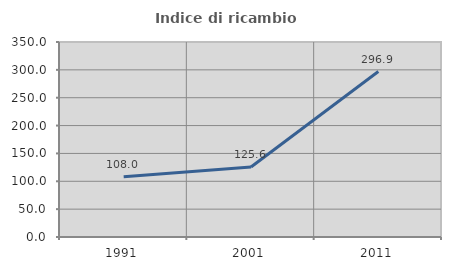
| Category | Indice di ricambio occupazionale  |
|---|---|
| 1991.0 | 108.012 |
| 2001.0 | 125.639 |
| 2011.0 | 296.949 |